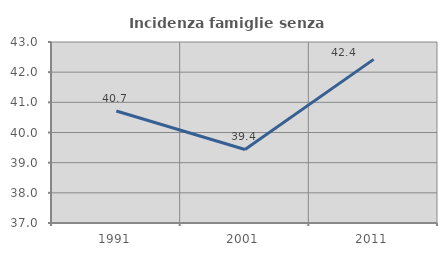
| Category | Incidenza famiglie senza nuclei |
|---|---|
| 1991.0 | 40.714 |
| 2001.0 | 39.437 |
| 2011.0 | 42.424 |